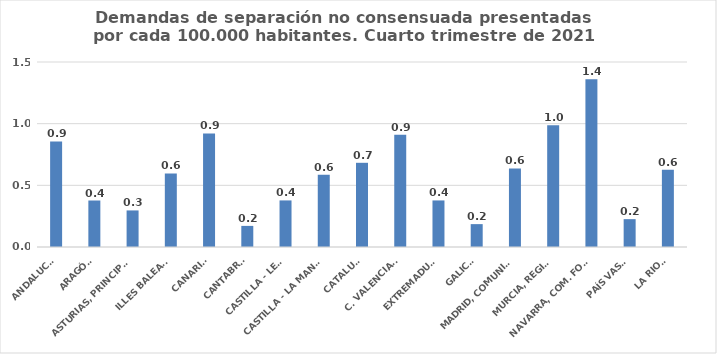
| Category | Series 0 |
|---|---|
| ANDALUCÍA | 0.856 |
| ARAGÓN | 0.377 |
| ASTURIAS, PRINCIPADO | 0.297 |
| ILLES BALEARS | 0.597 |
| CANARIAS | 0.92 |
| CANTABRIA | 0.171 |
| CASTILLA - LEÓN | 0.378 |
| CASTILLA - LA MANCHA | 0.585 |
| CATALUÑA | 0.683 |
| C. VALENCIANA | 0.909 |
| EXTREMADURA | 0.378 |
| GALICIA | 0.185 |
| MADRID, COMUNIDAD | 0.637 |
| MURCIA, REGIÓN | 0.988 |
| NAVARRA, COM. FORAL | 1.36 |
| PAÍS VASCO | 0.226 |
| LA RIOJA | 0.625 |